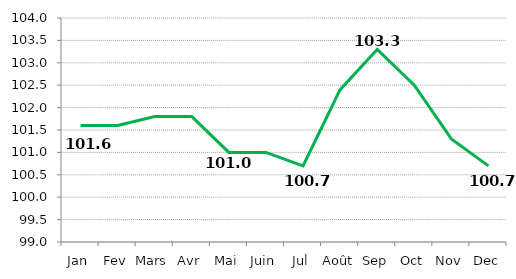
| Category |   INDICE  GENERAL     |
|---|---|
| Jan | 101.6 |
| Fev | 101.6 |
| Mars | 101.8 |
| Avr | 101.8 |
| Mai | 101 |
| Juin | 101 |
| Jul | 100.7 |
| Août | 102.4 |
| Sep | 103.3 |
| Oct | 102.5 |
| Nov | 101.3 |
| Dec | 100.7 |